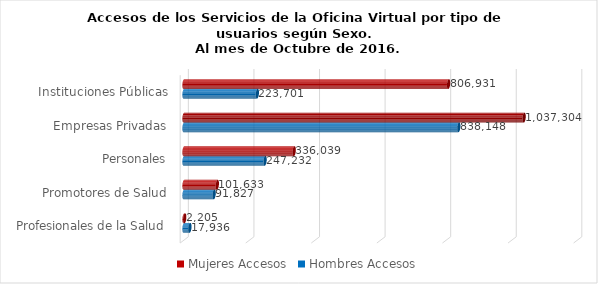
| Category | Mujeres | Hombres |
|---|---|---|
| Instituciones Públicas | 806931 | 223701 |
| Empresas Privadas | 1037304 | 838148 |
| Personales | 336039 | 247232 |
| Promotores de Salud | 101633 | 91827 |
| Profesionales de la Salud | 2205 | 17936 |